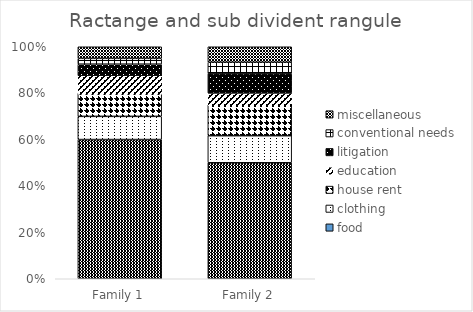
| Category | food | clothing | house rent | education | litigation | conventional needs | miscellaneous |
|---|---|---|---|---|---|---|---|
| Family 1 | 24 | 4 | 4 | 3 | 2 | 1 | 2 |
| Family 2 | 60 | 14 | 16 | 6 | 10 | 6 | 8 |